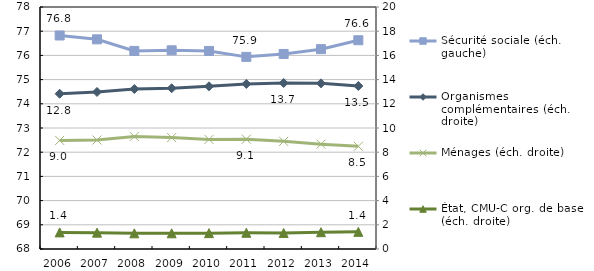
| Category | Sécurité sociale (éch. gauche) |
|---|---|
| 2006.0 | 76.822 |
| 2007.0 | 76.664 |
| 2008.0 | 76.185 |
| 2009.0 | 76.211 |
| 2010.0 | 76.185 |
| 2011.0 | 75.94 |
| 2012.0 | 76.06 |
| 2013.0 | 76.258 |
| 2014.0 | 76.626 |